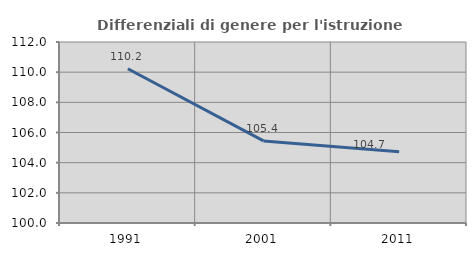
| Category | Differenziali di genere per l'istruzione superiore |
|---|---|
| 1991.0 | 110.226 |
| 2001.0 | 105.443 |
| 2011.0 | 104.731 |